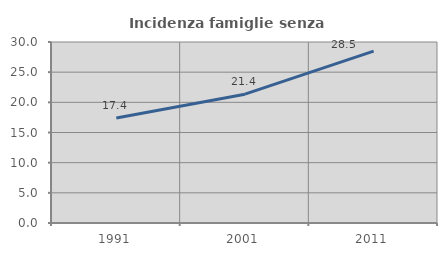
| Category | Incidenza famiglie senza nuclei |
|---|---|
| 1991.0 | 17.399 |
| 2001.0 | 21.352 |
| 2011.0 | 28.498 |